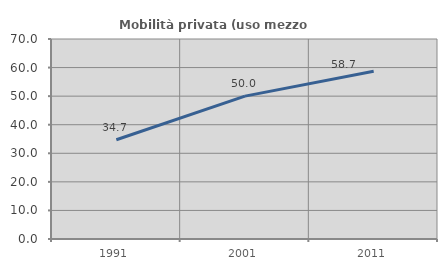
| Category | Mobilità privata (uso mezzo privato) |
|---|---|
| 1991.0 | 34.727 |
| 2001.0 | 50 |
| 2011.0 | 58.73 |